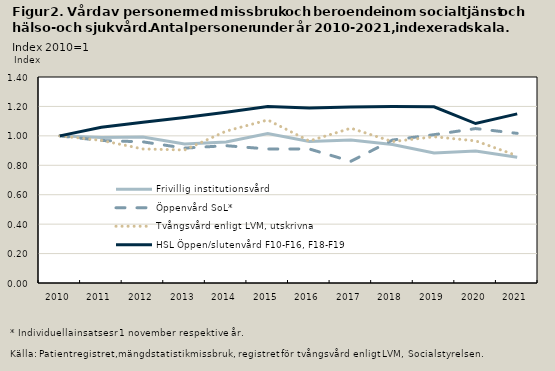
| Category | Frivillig institutionsvård | Öppenvård SoL* | Tvångsvård enligt LVM, utskrivna | HSL Öppen/slutenvård F10-F16, F18-F19 |
|---|---|---|---|---|
| 2010.0 | 1 | 1 | 1 | 1 |
| 2011.0 | 0.988 | 0.968 | 0.969 | 1.059 |
| 2012.0 | 0.993 | 0.959 | 0.911 | 1.093 |
| 2013.0 | 0.944 | 0.917 | 0.904 | 1.124 |
| 2014.0 | 0.958 | 0.933 | 1.032 | 1.16 |
| 2015.0 | 1.015 | 0.911 | 1.108 | 1.2 |
| 2016.0 | 0.961 | 0.911 | 0.965 | 1.189 |
| 2017.0 | 0.972 | 0.827 | 1.052 | 1.197 |
| 2018.0 | 0.941 | 0.971 | 0.961 | 1.2 |
| 2019.0 | 0.884 | 1.008 | 0.994 | 1.198 |
| 2020.0 | 0.897 | 1.05 | 0.966 | 1.084 |
| 2021.0 | 0.855 | 1.017 | 0.865 | 1.149 |